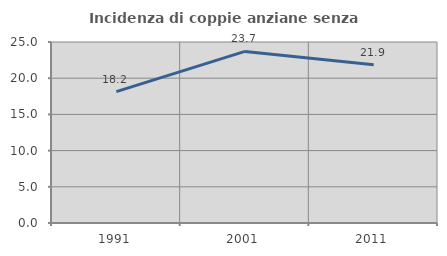
| Category | Incidenza di coppie anziane senza figli  |
|---|---|
| 1991.0 | 18.154 |
| 2001.0 | 23.704 |
| 2011.0 | 21.862 |